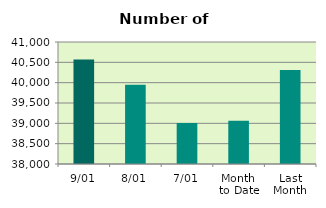
| Category | Series 0 |
|---|---|
| 9/01 | 40570 |
| 8/01 | 39948 |
| 7/01 | 39008 |
| Month 
to Date | 39065.667 |
| Last
Month | 40313.8 |